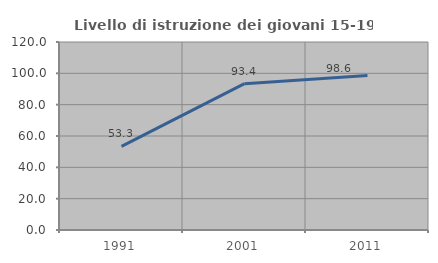
| Category | Livello di istruzione dei giovani 15-19 anni |
|---|---|
| 1991.0 | 53.333 |
| 2001.0 | 93.377 |
| 2011.0 | 98.592 |